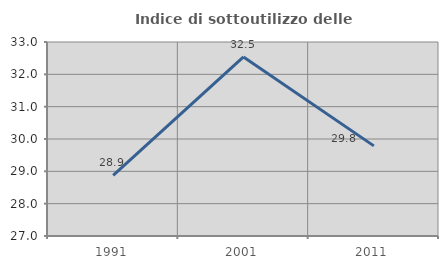
| Category | Indice di sottoutilizzo delle abitazioni  |
|---|---|
| 1991.0 | 28.873 |
| 2001.0 | 32.537 |
| 2011.0 | 29.787 |